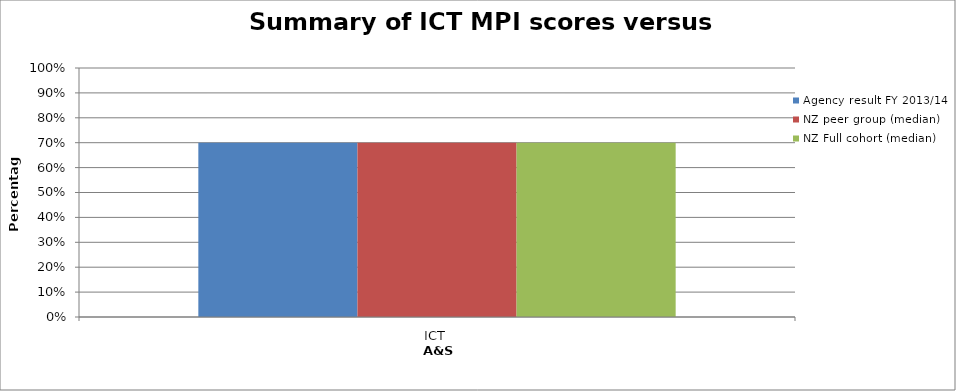
| Category | Agency result FY 2013/14  | NZ peer group (median) | NZ Full cohort (median) |
|---|---|---|---|
| ICT | 0.7 | 0.7 | 0.7 |